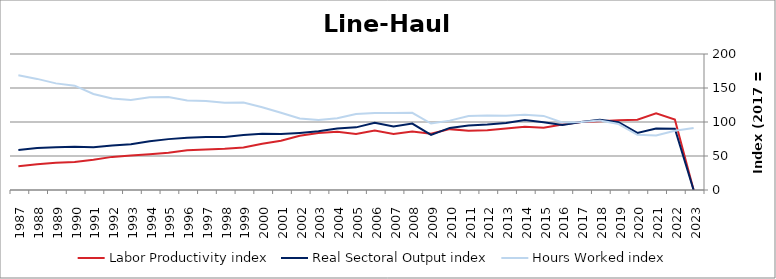
| Category | Labor Productivity index | Real Sectoral Output index | Hours Worked index |
|---|---|---|---|
| 2023.0 | 0 | 0 | 91.245 |
| 2022.0 | 103.509 | 90.196 | 87.138 |
| 2021.0 | 112.71 | 90.429 | 80.232 |
| 2020.0 | 103.307 | 83.902 | 81.216 |
| 2019.0 | 102.606 | 99.509 | 96.981 |
| 2018.0 | 101.038 | 103.213 | 102.152 |
| 2017.0 | 100 | 100 | 100 |
| 2016.0 | 96.442 | 95.707 | 99.239 |
| 2015.0 | 91.529 | 99.702 | 108.929 |
| 2014.0 | 92.902 | 102.831 | 110.688 |
| 2013.0 | 90.316 | 98.509 | 109.071 |
| 2012.0 | 88.002 | 96.277 | 109.402 |
| 2011.0 | 87.044 | 94.788 | 108.896 |
| 2010.0 | 89.513 | 91.304 | 102.001 |
| 2009.0 | 82.802 | 80.924 | 97.732 |
| 2008.0 | 86.172 | 97.739 | 113.423 |
| 2007.0 | 82.498 | 93.507 | 113.344 |
| 2006.0 | 87.299 | 98.881 | 113.267 |
| 2005.0 | 82.524 | 92.124 | 111.632 |
| 2004.0 | 85.638 | 90.27 | 105.41 |
| 2003.0 | 83.846 | 86.251 | 102.868 |
| 2002.0 | 79.884 | 83.965 | 105.109 |
| 2001.0 | 72.36 | 82.202 | 113.601 |
| 2000.0 | 67.88 | 82.685 | 121.811 |
| 1999.0 | 62.665 | 80.722 | 128.815 |
| 1998.0 | 60.651 | 77.789 | 128.256 |
| 1997.0 | 59.399 | 77.769 | 130.926 |
| 1996.0 | 58.432 | 76.895 | 131.597 |
| 1995.0 | 54.657 | 74.819 | 136.889 |
| 1994.0 | 52.535 | 71.561 | 136.218 |
| 1993.0 | 50.739 | 67.205 | 132.451 |
| 1992.0 | 48.709 | 65.557 | 134.59 |
| 1991.0 | 44.588 | 62.954 | 141.191 |
| 1990.0 | 41.351 | 63.43 | 153.395 |
| 1989.0 | 40.006 | 62.729 | 156.799 |
| 1988.0 | 37.844 | 61.833 | 163.387 |
| 1987.0 | 34.911 | 58.869 | 168.625 |